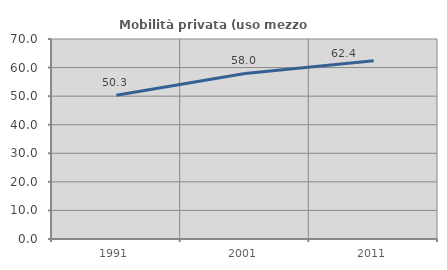
| Category | Mobilità privata (uso mezzo privato) |
|---|---|
| 1991.0 | 50.28 |
| 2001.0 | 57.955 |
| 2011.0 | 62.416 |